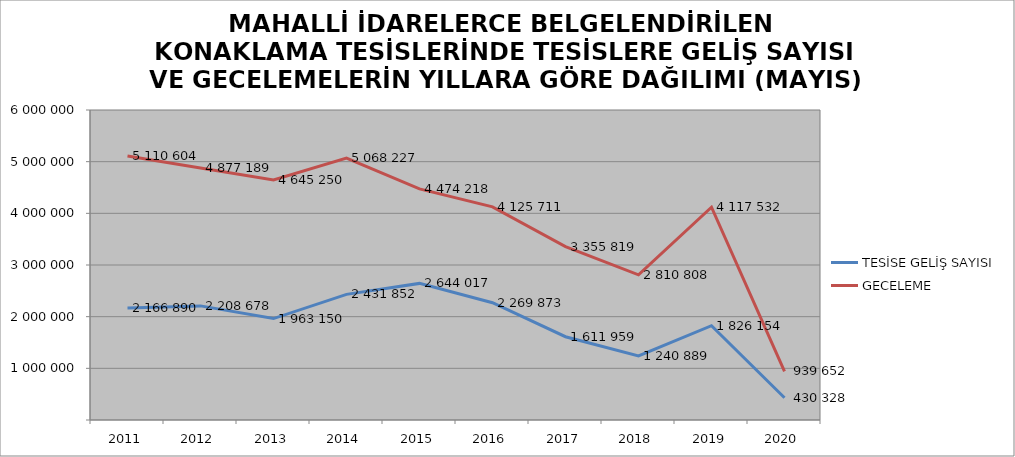
| Category | TESİSE GELİŞ SAYISI | GECELEME |
|---|---|---|
| 2011 | 2166890 | 5110604 |
| 2012 | 2208678 | 4877189 |
| 2013 | 1963150 | 4645250 |
| 2014 | 2431852 | 5068227 |
| 2015 | 2644017 | 4474218 |
| 2016 | 2269873 | 4125711 |
| 2017 | 1611959 | 3355819 |
| 2018 | 1240889 | 2810808 |
| 2019 | 1826154 | 4117532 |
| 2020 | 430328 | 939652 |